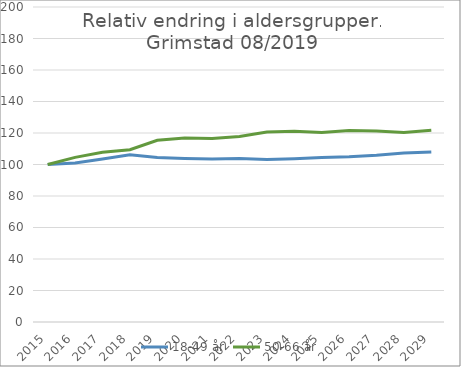
| Category | 18-49 år | 50-66 år |
|---|---|---|
| 2015.0 | 100 | 100 |
| 2016.0 | 100.913 | 104.51 |
| 2017.0 | 103.45 | 107.811 |
| 2018.0 | 106.181 | 109.384 |
| 2019.0 | 104.404 | 115.413 |
| 2020.0 | 103.774 | 116.889 |
| 2021.0 | 103.418 | 116.557 |
| 2022.0 | 103.76 | 117.718 |
| 2023.0 | 103.113 | 120.667 |
| 2024.0 | 103.63 | 121.052 |
| 2025.0 | 104.51 | 120.356 |
| 2026.0 | 104.939 | 121.526 |
| 2027.0 | 105.871 | 121.204 |
| 2028.0 | 107.254 | 120.256 |
| 2029.0 | 107.917 | 121.755 |